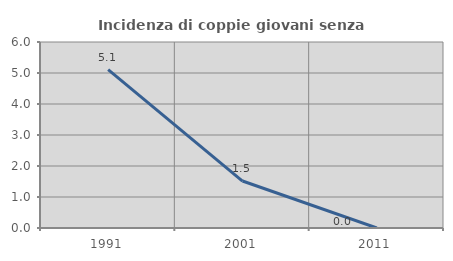
| Category | Incidenza di coppie giovani senza figli |
|---|---|
| 1991.0 | 5.109 |
| 2001.0 | 1.515 |
| 2011.0 | 0 |